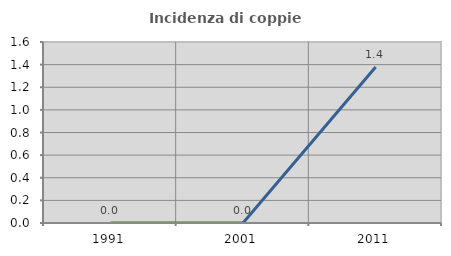
| Category | Incidenza di coppie miste |
|---|---|
| 1991.0 | 0 |
| 2001.0 | 0 |
| 2011.0 | 1.379 |